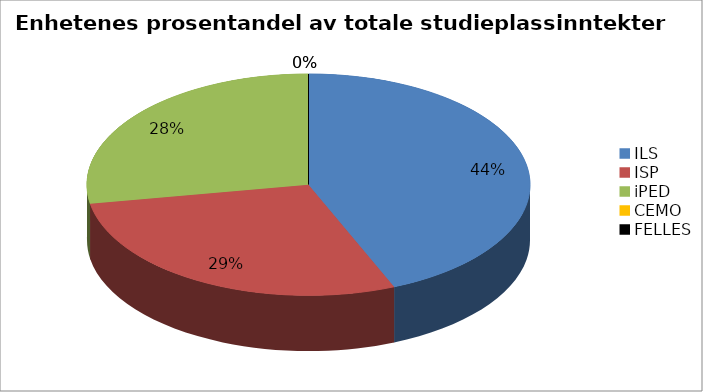
| Category | Series 0 |
|---|---|
| ILS | 36373000 |
| ISP | 23782000 |
| iPED | 23102000 |
| CEMO | 0 |
| FELLES | 0 |